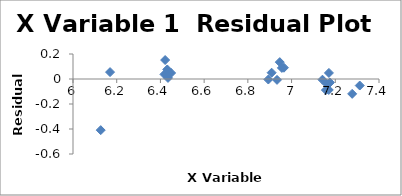
| Category | Series 0 |
|---|---|
| 6.965080345601407 | 0.09 |
| 6.955592608396297 | 0.089 |
| 6.946013991099227 | 0.135 |
| 6.933423025730714 | -0.007 |
| 6.90875477931522 | 0.05 |
| 6.893656354602635 | -0.004 |
| 7.277247726631484 | -0.119 |
| 6.126869184114185 | -0.409 |
| 7.141245122350491 | -0.006 |
| 7.156956364615636 | -0.089 |
| 7.170888478512505 | 0.049 |
| 7.160069207596127 | -0.037 |
| 7.170119543449628 | -0.088 |
| 7.175489713624221 | -0.028 |
| 6.448889394146857 | 0.048 |
| 6.431331081933478 | 0.076 |
| 6.434546518787453 | 0.009 |
| 6.429719478039137 | 0.048 |
| 6.418364935936212 | 0.037 |
| 6.421622267806518 | 0.152 |
| 6.169610732491456 | 0.055 |
| 7.311886164077164 | -0.052 |